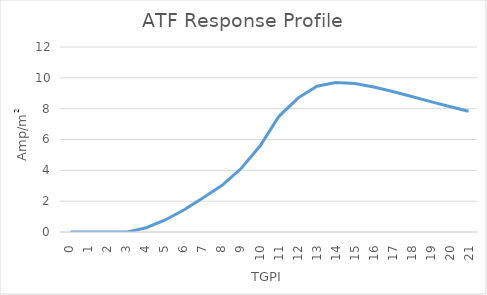
| Category | Series 0 |
|---|---|
| 0.0 | 0 |
| 1.0 | 0 |
| 2.0 | 0 |
| 3.0 | 0 |
| 4.0 | 0.278 |
| 5.0 | 0.778 |
| 6.0 | 1.442 |
| 7.0 | 2.223 |
| 8.0 | 3.029 |
| 9.0 | 4.116 |
| 10.0 | 5.578 |
| 11.0 | 7.504 |
| 12.0 | 8.685 |
| 13.0 | 9.458 |
| 14.0 | 9.698 |
| 15.0 | 9.629 |
| 16.0 | 9.405 |
| 17.0 | 9.11 |
| 18.0 | 8.787 |
| 19.0 | 8.459 |
| 20.0 | 8.138 |
| 21.0 | 7.829 |